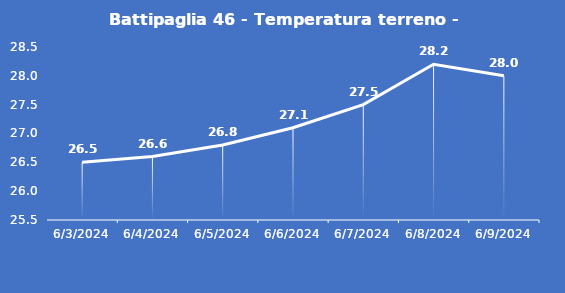
| Category | Battipaglia 46 - Temperatura terreno - Max (°C) |
|---|---|
| 6/3/24 | 26.5 |
| 6/4/24 | 26.6 |
| 6/5/24 | 26.8 |
| 6/6/24 | 27.1 |
| 6/7/24 | 27.5 |
| 6/8/24 | 28.2 |
| 6/9/24 | 28 |